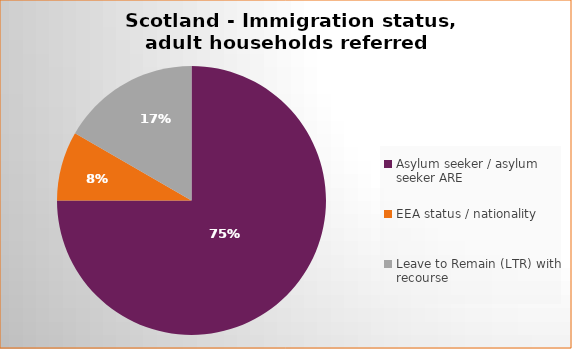
| Category | Number  | Percentage |
|---|---|---|
| Asylum seeker / asylum seeker ARE | 9 | 0.75 |
| EEA status / nationality  | 1 | 0.083 |
| Leave to Remain (LTR) with recourse | 2 | 0.167 |